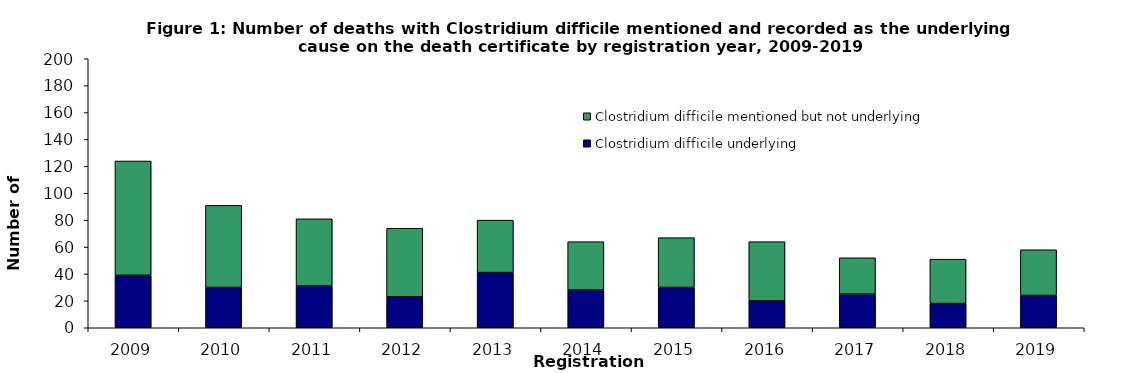
| Category | Clostridium difficile underlying | Clostridium difficile mentioned but not underlying |
|---|---|---|
| 2009 | 39 | 85 |
| 2010 | 30 | 61 |
| 2011 | 31 | 50 |
| 2012 | 23 | 51 |
| 2013 | 41 | 39 |
| 2014 | 28 | 36 |
| 2015 | 30 | 37 |
| 2016 | 20 | 44 |
| 2017 | 25 | 27 |
| 2018 | 18 | 33 |
| 2019 | 24 | 34 |